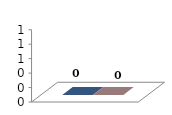
| Category | M | F |
|---|---|---|
| 0 | 0 | 0 |